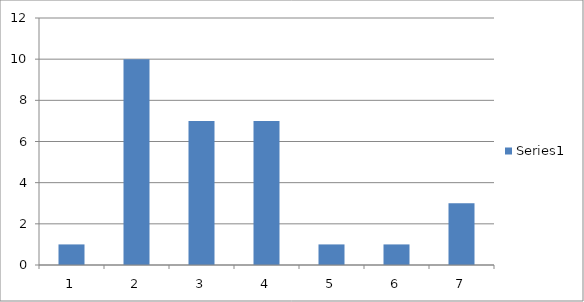
| Category | Series 0 |
|---|---|
| 0 | 1 |
| 1 | 10 |
| 2 | 7 |
| 3 | 7 |
| 4 | 1 |
| 5 | 1 |
| 6 | 3 |